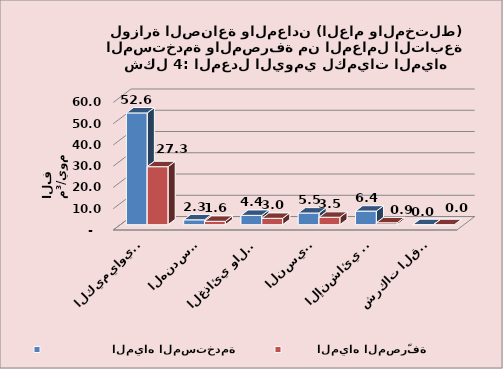
| Category |                  المياه المستخدمة                   |         المياه المصرّفة                   |
|---|---|---|
| الكيمياوي والبتروكيمياوي | 52.6 | 27.3 |
| الهندسي  | 2.3 | 1.6 |
| الغذائي والدوائي | 4.4 | 3 |
| النسيجي | 5.5 | 3.5 |
| الإنشائي والخدمات الصناعية | 6.4 | 0.9 |
| شركات القطاع المختلط | 0.036 | 0.02 |